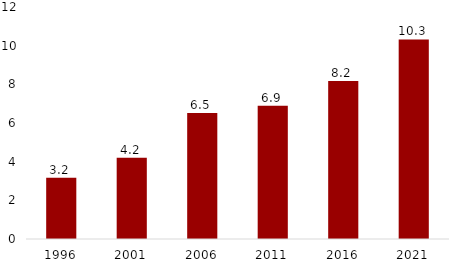
| Category | Series 1 |
|---|---|
| 1996.0 | 3.166 |
| 2001.0 | 4.2 |
| 2006.0 | 6.514 |
| 2011.0 | 6.892 |
| 2016.0 | 8.175 |
| 2021.0 | 10.323 |